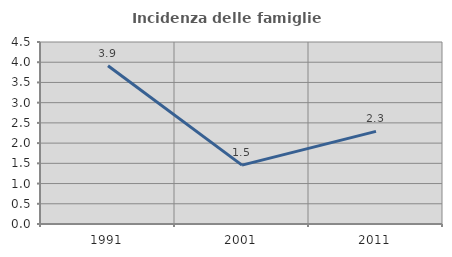
| Category | Incidenza delle famiglie numerose |
|---|---|
| 1991.0 | 3.914 |
| 2001.0 | 1.455 |
| 2011.0 | 2.291 |